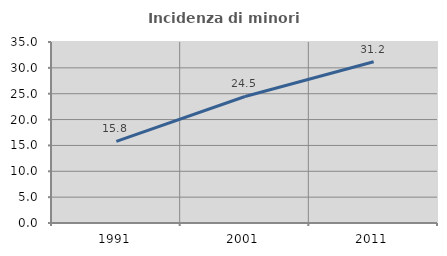
| Category | Incidenza di minori stranieri |
|---|---|
| 1991.0 | 15.789 |
| 2001.0 | 24.464 |
| 2011.0 | 31.179 |